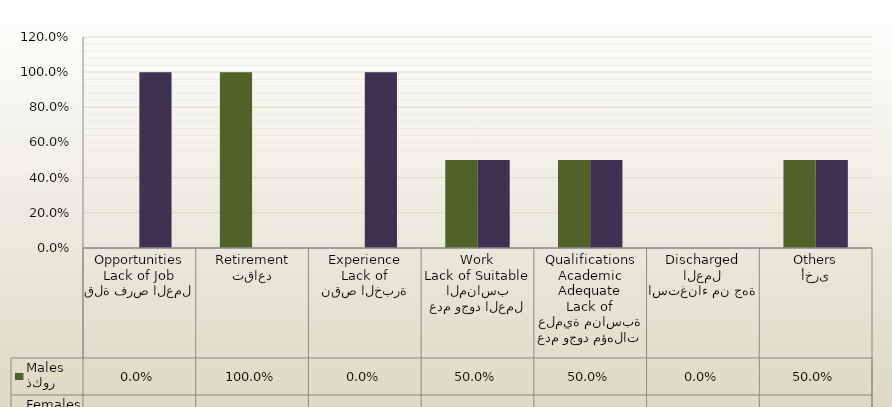
| Category | ذكور
Males | اناث
Females |
|---|---|---|
| قلة فرص العمل
Lack of Job Opportunities | 0 | 1 |
| تقاعد
Retirement | 1 | 0 |
| نقص الخبرة
Lack of Experience | 0 | 1 |
| عدم وجود العمل المناسب
Lack of Suitable Work | 0.5 | 0.5 |
| عدم وجود مؤهلات علمية مناسبة
Lack of Adequate Academic Qualifications | 0.5 | 0.5 |
| استغناء من جهة العمل
Discharged | 0 | 0 |
| أخرى
Others | 0.5 | 0.5 |